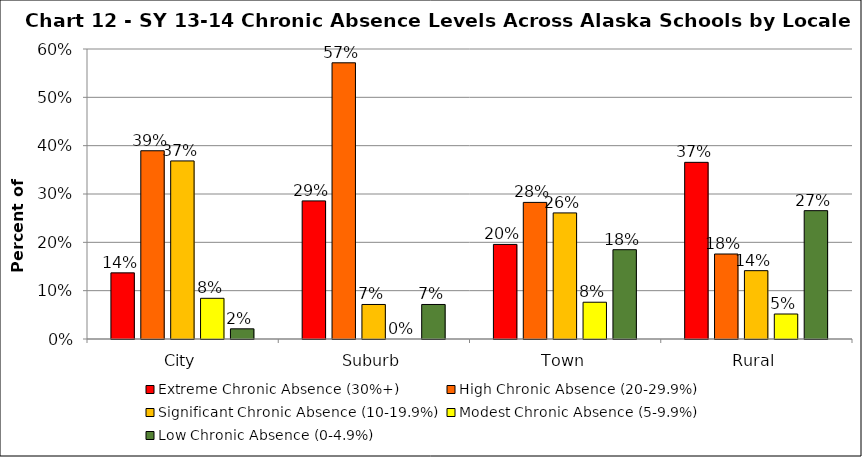
| Category | Extreme Chronic Absence (30%+) | High Chronic Absence (20-29.9%) | Significant Chronic Absence (10-19.9%) | Modest Chronic Absence (5-9.9%) | Low Chronic Absence (0-4.9%) |
|---|---|---|---|---|---|
| 0 | 0.137 | 0.389 | 0.368 | 0.084 | 0.021 |
| 1 | 0.286 | 0.571 | 0.071 | 0 | 0.071 |
| 2 | 0.196 | 0.283 | 0.261 | 0.076 | 0.185 |
| 3 | 0.366 | 0.176 | 0.141 | 0.052 | 0.266 |